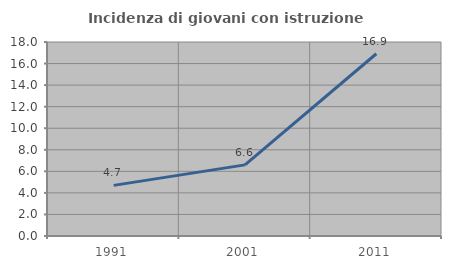
| Category | Incidenza di giovani con istruzione universitaria |
|---|---|
| 1991.0 | 4.696 |
| 2001.0 | 6.599 |
| 2011.0 | 16.91 |